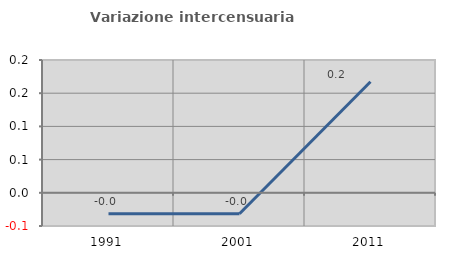
| Category | Variazione intercensuaria annua |
|---|---|
| 1991.0 | -0.031 |
| 2001.0 | -0.032 |
| 2011.0 | 0.167 |